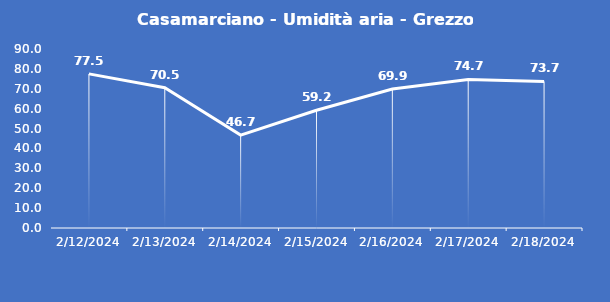
| Category | Casamarciano - Umidità aria - Grezzo (%) |
|---|---|
| 2/12/24 | 77.5 |
| 2/13/24 | 70.5 |
| 2/14/24 | 46.7 |
| 2/15/24 | 59.2 |
| 2/16/24 | 69.9 |
| 2/17/24 | 74.7 |
| 2/18/24 | 73.7 |